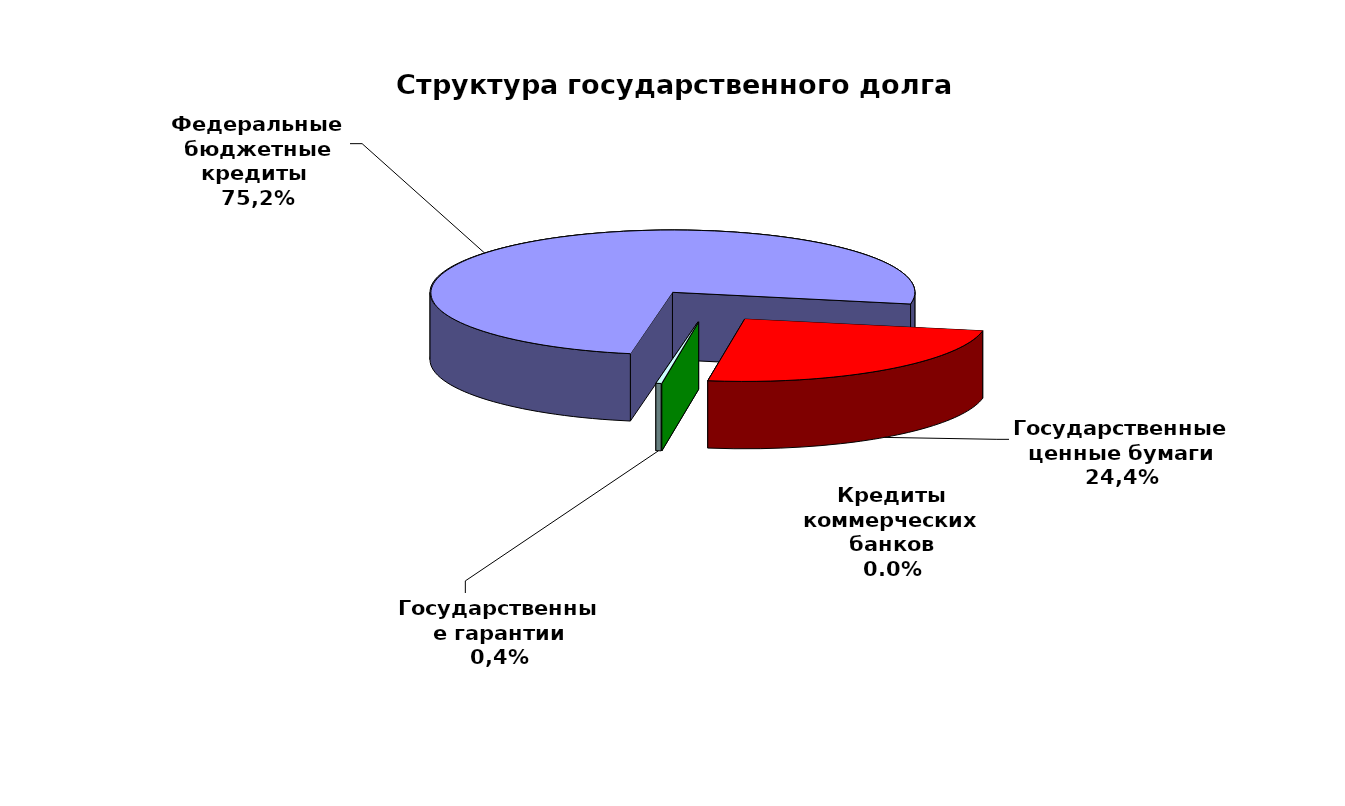
| Category | Series 0 |
|---|---|
| Федеральные бюджетные кредиты  | 104775268.721 |
| Государственные ценные бумаги | 34000000 |
| Кредиты коммерческих банков | 0 |
| Государственные гарантии | 489600.492 |